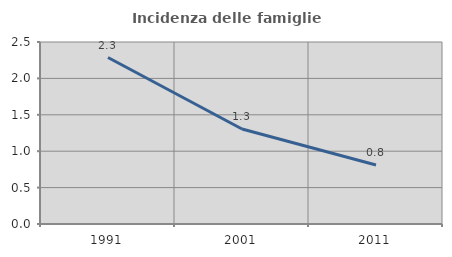
| Category | Incidenza delle famiglie numerose |
|---|---|
| 1991.0 | 2.287 |
| 2001.0 | 1.304 |
| 2011.0 | 0.81 |